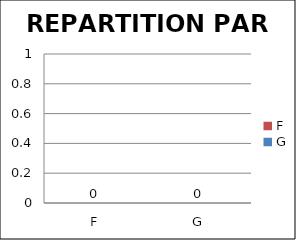
| Category | Series 0 |
|---|---|
| F | 0 |
| G | 0 |